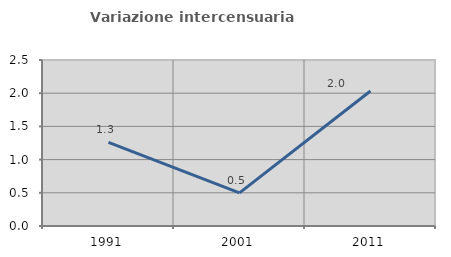
| Category | Variazione intercensuaria annua |
|---|---|
| 1991.0 | 1.26 |
| 2001.0 | 0.499 |
| 2011.0 | 2.034 |